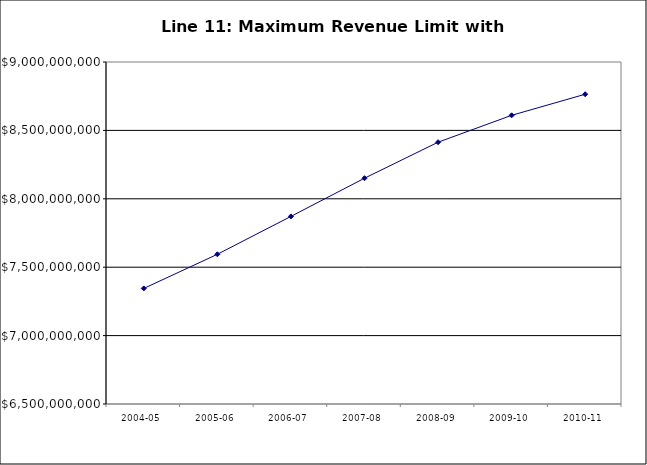
| Category | DISTRICT |
|---|---|
| 2004-05 | 7344776598 |
| 2005-06 | 7594299980 |
| 2006-07 | 7871372277 |
| 2007-08 | 8150510546 |
| 2008-09 | 8413663616 |
| 2009-10 | 8610268995 |
| 2010-11 | 8764473630 |